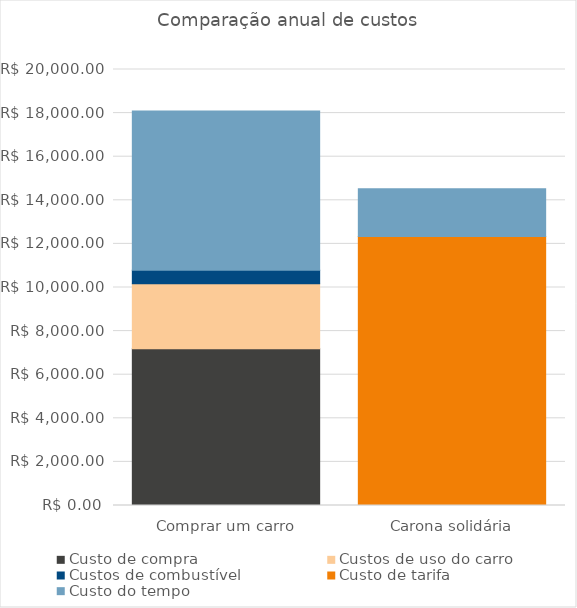
| Category | Custo de compra | Custos de uso do carro | Custos de combustível | Custo de tarifa | Custo do tempo |
|---|---|---|---|---|---|
| Comprar um carro | 7187.315 | 2990 | 617.692 | 0 | 7300 |
| Carona solidária | 0 | 0 | 0 | 12340.65 | 2190 |